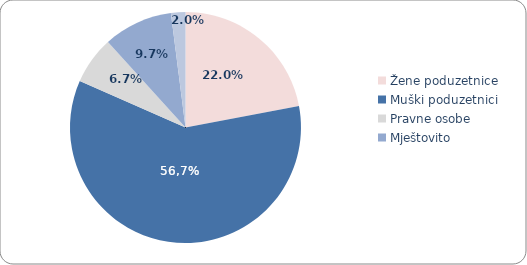
| Category | Series 0 |
|---|---|
| Žene poduzetnice  | 0.22 |
| Muški poduzetnici | 0.596 |
| Pravne osobe | 0.067 |
| Mještovito | 0.097 |
| Neodređeno | 0.02 |